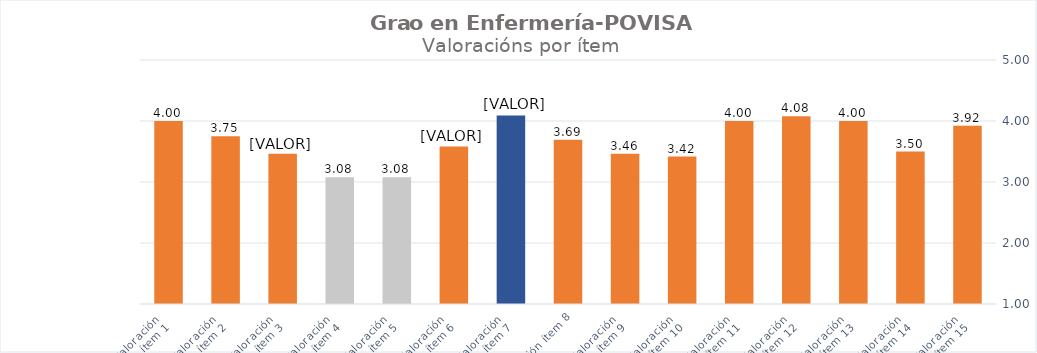
| Category | Series 0 |
|---|---|
| Valoración 
ítem 1 | 4 |
| Valoración 
ítem 2 | 3.75 |
| Valoración 
ítem 3 | 3.462 |
| Valoración 
ítem 4 | 3.077 |
| Valoración 
ítem 5 | 3.077 |
| Valoración 
ítem 6 | 3.583 |
| Valoración 
ítem 7 | 4.091 |
| Valoración ítem 8 | 3.692 |
| Valoración 
ítem 9 | 3.462 |
| Valoración 
ítem 10 | 3.417 |
| Valoración 
ítem 11 | 4 |
| Valoración 
ítem 12 | 4.077 |
| Valoración 
ítem 13 | 4 |
| Valoración 
ítem 14 | 3.5 |
| Valoración 
ítem 15 | 3.923 |